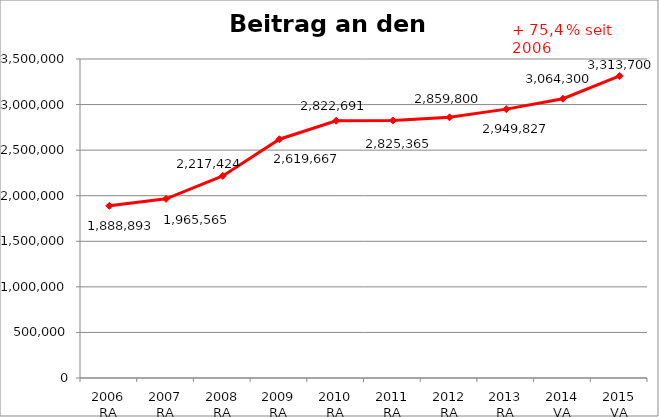
| Category | Beitrag an den Sozialfonds |
|---|---|
| 2006 RA | 1888893 |
| 2007 RA | 1965565 |
| 2008 RA | 2217424 |
| 2009 RA | 2619667 |
| 2010 RA | 2822691 |
| 2011 RA | 2825365 |
| 2012 RA | 2859800 |
| 2013 RA | 2949827 |
| 2014 VA | 3064300 |
| 2015 VA | 3313700 |